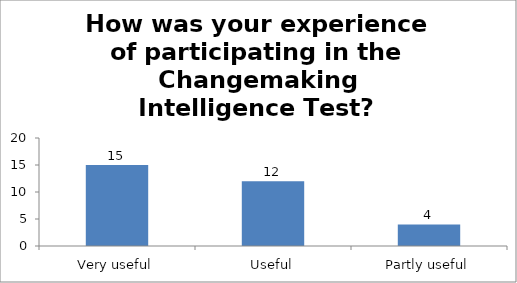
| Category | How was your experience of participating in the Changemaking Intelligence Test? |
|---|---|
| Very useful | 15 |
| Useful | 12 |
| Partly useful | 4 |